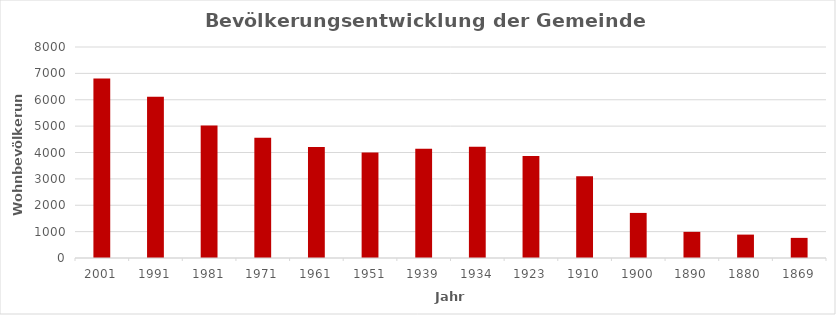
| Category | Series 5 |
|---|---|
| 2001 | 6808 |
| 1991 | 6111 |
| 1981 | 5021 |
| 1971 | 4558 |
| 1961 | 4207 |
| 1951 | 3996 |
| 1939 | 4144 |
| 1934 | 4219 |
| 1923 | 3865 |
| 1910 | 3101 |
| 1900 | 1709 |
| 1890 | 991 |
| 1880 | 887 |
| 1869 | 763 |